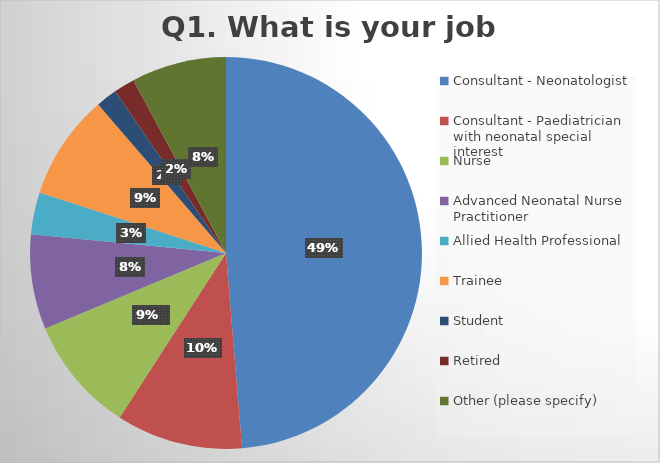
| Category | Series 0 |
|---|---|
| Consultant - Neonatologist | 56 |
| Consultant - Paediatrician with neonatal special interest | 12 |
| Nurse | 11 |
| Advanced Neonatal Nurse Practitioner | 9 |
| Allied Health Professional | 4 |
| Trainee | 10 |
| Student | 2 |
| Retired | 2 |
| Other (please specify) | 9 |